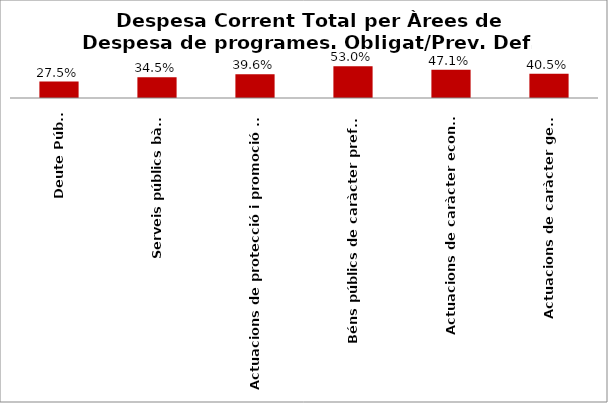
| Category | Series 0 |
|---|---|
| Deute Públic | 0.275 |
| Serveis públics bàsics | 0.345 |
| Actuacions de protecció i promoció social | 0.396 |
| Béns públics de caràcter preferent | 0.53 |
| Actuacions de caràcter econòmic | 0.471 |
| Actuacions de caràcter general | 0.405 |